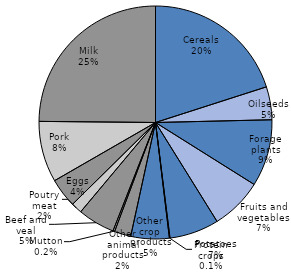
| Category | Series 0 |
|---|---|
| Cereals | 0.201 |
| Oilseeds | 0.046 |
| Forage plants | 0.093 |
| Fruits and vegetables | 0.072 |
| Potatoes | 0.069 |
| Protein crops | 0.001 |
| Other 
crop 
products | 0.053 |
| Other animal products | 0.023 |
| Mutton | 0.002 |
| Beef and veal | 0.052 |
| Poutry meat | 0.015 |
| Eggs | 0.041 |
| Pork | 0.085 |
| Milk | 0.248 |